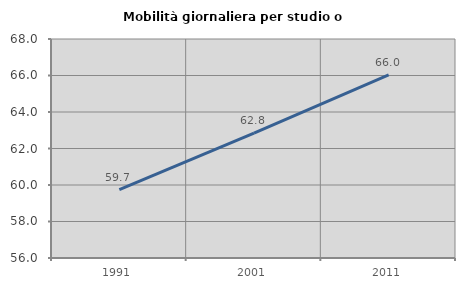
| Category | Mobilità giornaliera per studio o lavoro |
|---|---|
| 1991.0 | 59.744 |
| 2001.0 | 62.848 |
| 2011.0 | 66.029 |